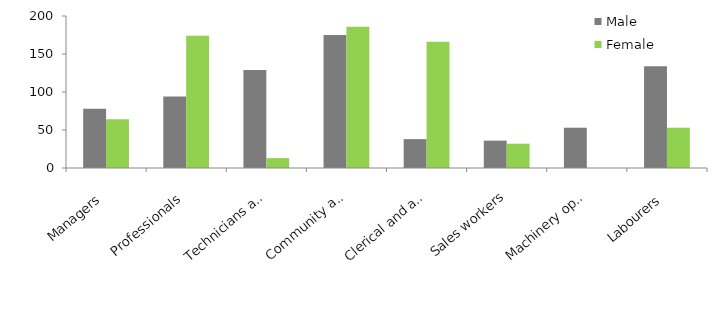
| Category | Male | Female |
|---|---|---|
| Managers | 78 | 64 |
| Professionals | 94 | 174 |
| Technicians and trades workers | 129 | 13 |
| Community and personal service workers | 175 | 186 |
| Clerical and administrative workers | 38 | 166 |
| Sales workers | 36 | 32 |
| Machinery operators and drivers | 53 | 0 |
| Labourers | 134 | 53 |